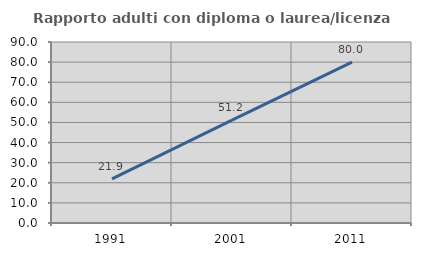
| Category | Rapporto adulti con diploma o laurea/licenza media  |
|---|---|
| 1991.0 | 21.937 |
| 2001.0 | 51.168 |
| 2011.0 | 80 |